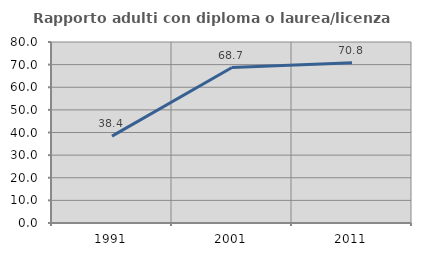
| Category | Rapporto adulti con diploma o laurea/licenza media  |
|---|---|
| 1991.0 | 38.404 |
| 2001.0 | 68.717 |
| 2011.0 | 70.803 |